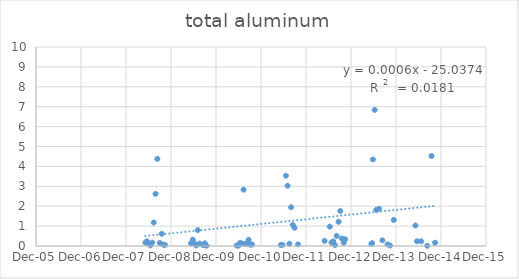
| Category | Series 0 |
|---|---|
| 39577.0 | 0.174 |
| 39590.0 | 0.236 |
| 39604.0 | 0.118 |
| 39618.0 | 0.03 |
| 39633.0 | 0.167 |
| 39645.0 | 1.18 |
| 39660.0 | 2.62 |
| 39674.0 | 4.38 |
| 39695.0 | 0.15 |
| 39710.0 | 0.613 |
| 39723.0 | 0.066 |
| 39736.0 | 0.055 |
| 39947.0 | 0.133 |
| 39961.0 | 0.32 |
| 39974.0 | 0.139 |
| 39989.0 | 0.028 |
| 40002.0 | 0.797 |
| 40017.0 | 0.122 |
| 40045.0 | 0.041 |
| 40059.0 | 0.136 |
| 40073.0 | 0.014 |
| 40317.0 | 0.023 |
| 40332.0 | 0.019 |
| 40346.0 | 0.163 |
| 40359.0 | 0.116 |
| 40374.0 | 2.83 |
| 40388.0 | 0.118 |
| 40402.0 | 0.11 |
| 40415.0 | 0.31 |
| 40429.0 | 0.063 |
| 40443.0 | 0.075 |
| 40675.0 | 0.047 |
| 40689.0 | 0.058 |
| 40717.0 | 3.53 |
| 40731.0 | 3.03 |
| 40745.0 | 0.115 |
| 40759.0 | 1.95 |
| 40773.0 | 1.06 |
| 40787.0 | 0.917 |
| 40815.0 | 0.08 |
| 41031.0 | 0.255 |
| 41059.0 | 27 |
| 41073.0 | 0.972 |
| 41087.0 | 0.176 |
| 41101.0 | 0.23 |
| 41115.0 | 0.05 |
| 41129.0 | 0.505 |
| 41144.0 | 1.22 |
| 41158.0 | 1.76 |
| 41171.0 | 0.377 |
| 41186.0 | 0.162 |
| 41198.0 | 0.342 |
| 41410.0 | 0.107 |
| 41416.0 | 0.144 |
| 41423.0 | 4.35 |
| 41437.0 | 6.84 |
| 41450.0 | 1.82 |
| 41472.0 | 1.87 |
| 41500.0 | 0.285 |
| 41541.0 | 0.08 |
| 41563.0 | 0.022 |
| 41592.0 | 1.31 |
| 41768.0 | 1.03 |
| 41780.0 | 0.24 |
| 41814.0 | 0.236 |
| 41863.0 | 0.011 |
| 41898.0 | 4.52 |
| 41927.0 | 0.166 |